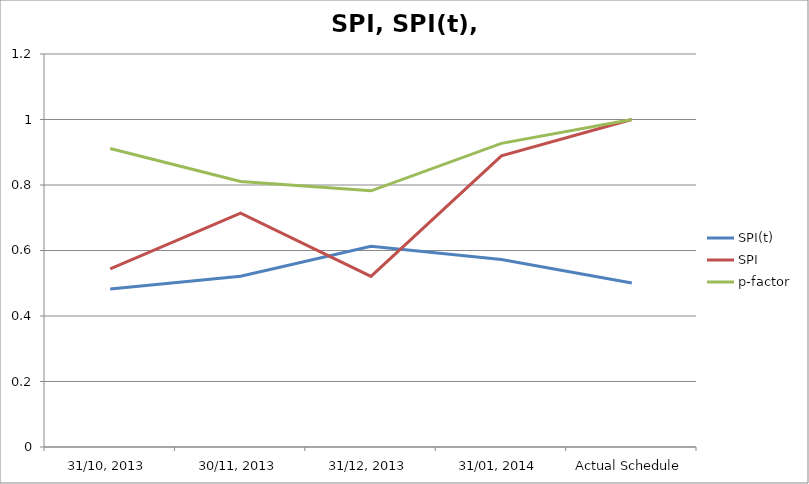
| Category | SPI(t) | SPI | p-factor |
|---|---|---|---|
| 31/10, 2013 | 0.482 | 0.544 | 0.912 |
| 30/11, 2013 | 0.521 | 0.714 | 0.811 |
| 31/12, 2013 | 0.613 | 0.521 | 0.782 |
| 31/01, 2014 | 0.573 | 0.889 | 0.927 |
| Actual Schedule | 0.501 | 1 | 1 |